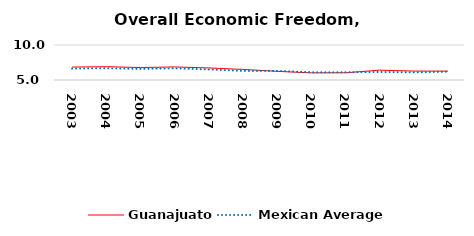
| Category | Guanajuato | Mexican Average  |
|---|---|---|
| 2003.0 | 6.845 | 6.632 |
| 2004.0 | 6.906 | 6.678 |
| 2005.0 | 6.777 | 6.582 |
| 2006.0 | 6.867 | 6.668 |
| 2007.0 | 6.721 | 6.508 |
| 2008.0 | 6.513 | 6.3 |
| 2009.0 | 6.237 | 6.3 |
| 2010.0 | 6.02 | 6.105 |
| 2011.0 | 6.029 | 6.103 |
| 2012.0 | 6.402 | 6.144 |
| 2013.0 | 6.275 | 6.087 |
| 2014.0 | 6.267 | 6.195 |